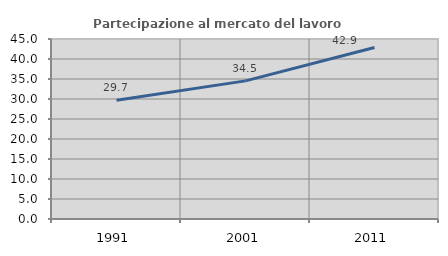
| Category | Partecipazione al mercato del lavoro  femminile |
|---|---|
| 1991.0 | 29.665 |
| 2001.0 | 34.529 |
| 2011.0 | 42.857 |